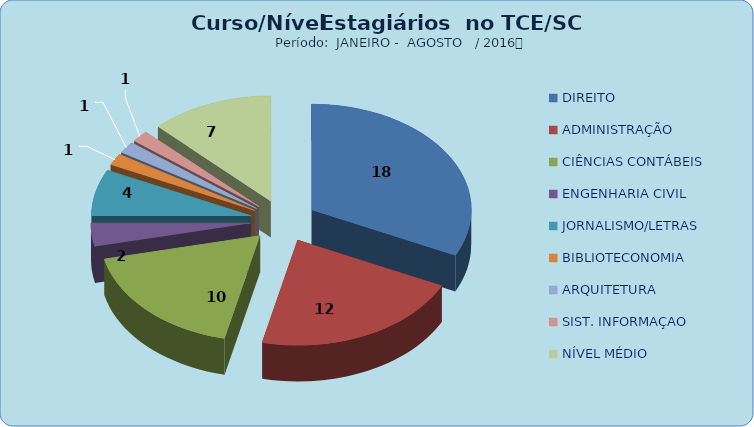
| Category | Series 0 |
|---|---|
| DIREITO | 18 |
| ADMINISTRAÇÃO | 12 |
| CIÊNCIAS CONTÁBEIS | 10 |
| ENGENHARIA CIVIL | 2 |
| JORNALISMO/LETRAS | 4 |
| BIBLIOTECONOMIA | 1 |
| ARQUITETURA | 1 |
| SIST. INFORMAÇAO | 1 |
| NÍVEL MÉDIO | 7 |